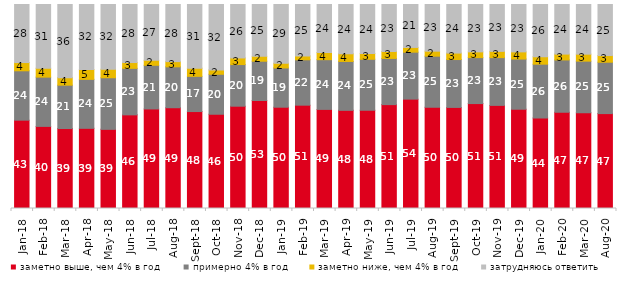
| Category | заметно выше, чем 4% в год | примерно 4% в год | заметно ниже, чем 4% в год | затрудняюсь ответить |
|---|---|---|---|---|
| 2018-01-01 | 43.3 | 24.2 | 4.05 | 28.45 |
| 2018-02-01 | 40.25 | 24.15 | 4.35 | 31.25 |
| 2018-03-01 | 39.2 | 21.25 | 3.7 | 35.85 |
| 2018-04-01 | 39.3 | 24 | 4.85 | 31.85 |
| 2018-05-01 | 38.8 | 25.3 | 4.15 | 31.75 |
| 2018-06-01 | 45.9 | 22.8 | 2.85 | 28.45 |
| 2018-07-01 | 48.8 | 21.4 | 2.45 | 27.35 |
| 2018-08-01 | 49.4 | 20.05 | 2.55 | 28 |
| 2018-09-01 | 47.5 | 17.25 | 4 | 31.2 |
| 2018-10-01 | 46.2 | 19.6 | 2.15 | 32.05 |
| 2018-11-01 | 50.15 | 20.409 | 3.244 | 26.198 |
| 2018-12-01 | 52.95 | 19.25 | 2.4 | 25.4 |
| 2019-01-01 | 49.65 | 19.25 | 2.3 | 28.8 |
| 2019-02-01 | 50.65 | 22.25 | 1.9 | 25.2 |
| 2019-03-01 | 48.583 | 24.366 | 3.531 | 23.521 |
| 2019-04-01 | 48.119 | 23.96 | 3.762 | 24.158 |
| 2019-05-01 | 48.143 | 25.012 | 2.823 | 24.022 |
| 2019-06-01 | 50.923 | 22.643 | 3.392 | 23.042 |
| 2019-07-01 | 53.614 | 23.02 | 2.327 | 21.04 |
| 2019-08-01 | 49.65 | 25.025 | 2.448 | 22.877 |
| 2019-09-01 | 49.554 | 23.465 | 3.168 | 23.812 |
| 2019-10-01 | 51.436 | 22.525 | 2.822 | 23.218 |
| 2019-11-01 | 50.545 | 23.416 | 3.069 | 22.97 |
| 2019-12-01 | 48.663 | 24.604 | 3.515 | 23.218 |
| 2020-01-01 | 44.307 | 26.436 | 3.614 | 25.644 |
| 2020-02-01 | 47.178 | 25.644 | 2.871 | 24.307 |
| 2020-03-01 | 46.901 | 25.335 | 3.421 | 24.343 |
| 2020-08-01 | 46.524 | 25.174 | 3.277 | 25.025 |